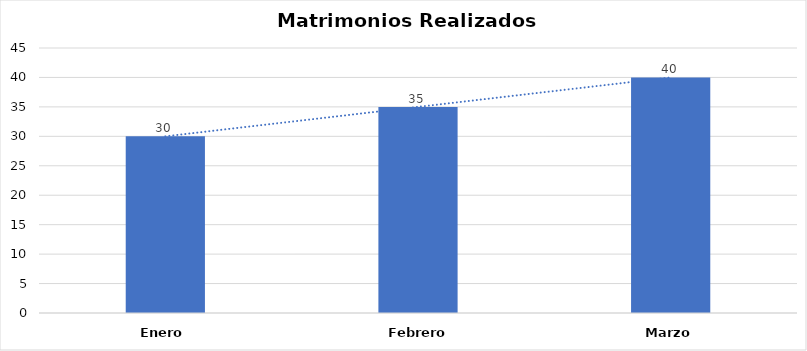
| Category | Series 0 |
|---|---|
| Enero | 30 |
| Febrero  | 35 |
| Marzo | 40 |